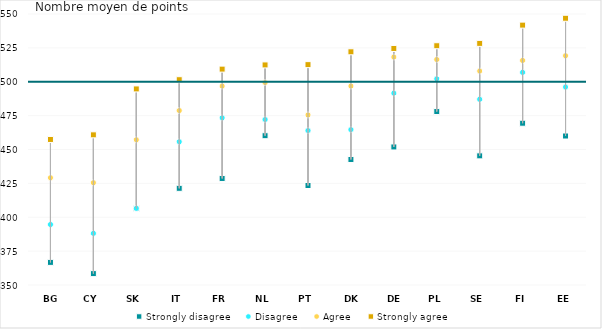
| Category | Strongly disagree | Disagree | Agree | Strongly agree |
|---|---|---|---|---|
| BG | 366.688 | 394.647 | 429.1 | 457.408 |
| CY | 358.401 | 388.13 | 425.469 | 460.826 |
| SK | 406.467 | 406.562 | 457.148 | 494.698 |
| IT | 421.35 | 455.685 | 478.733 | 501.5 |
| FR | 428.61 | 473.341 | 496.818 | 509.328 |
| NL | 460.181 | 472.121 | 499.368 | 512.416 |
| PT | 423.431 | 463.966 | 475.479 | 512.627 |
| DK | 442.628 | 464.656 | 496.845 | 522.112 |
| DE | 451.871 | 491.598 | 518.238 | 524.571 |
| PL | 478.003 | 502.129 | 516.418 | 526.571 |
| SE | 445.307 | 487.067 | 507.903 | 528.312 |
| FI | 469.386 | 506.932 | 515.723 | 541.791 |
| EE | 459.957 | 496.115 | 519.143 | 546.856 |